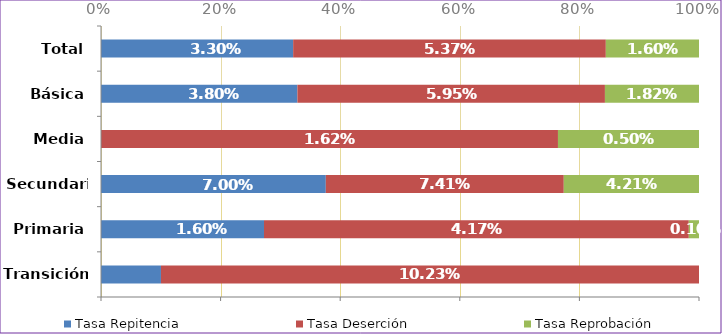
| Category | Tasa Repitencia | Tasa Deserción | Tasa Reprobación |
|---|---|---|---|
| Transición | 0.011 | 0.102 | 0 |
| Primaria | 0.016 | 0.042 | 0.001 |
| Secundaria | 0.07 | 0.074 | 0.042 |
| Media | 0 | 0.016 | 0.005 |
| Básica | 0.038 | 0.06 | 0.018 |
| Total | 0.033 | 0.054 | 0.016 |